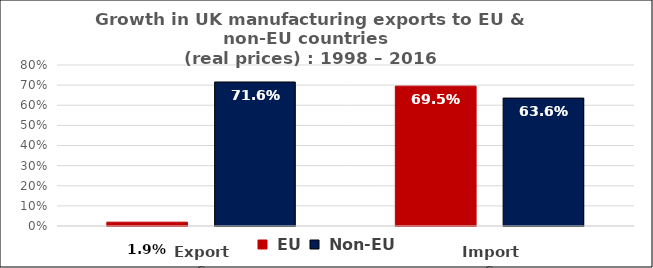
| Category |  EU |  Non-EU |
|---|---|---|
| Exports | 0.019 | 0.716 |
| Imports | 0.695 | 0.636 |